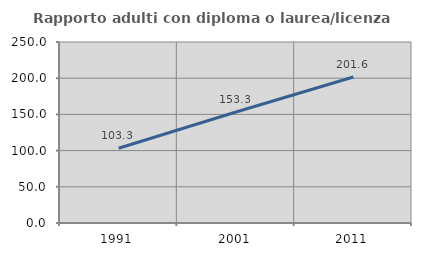
| Category | Rapporto adulti con diploma o laurea/licenza media  |
|---|---|
| 1991.0 | 103.313 |
| 2001.0 | 153.274 |
| 2011.0 | 201.616 |